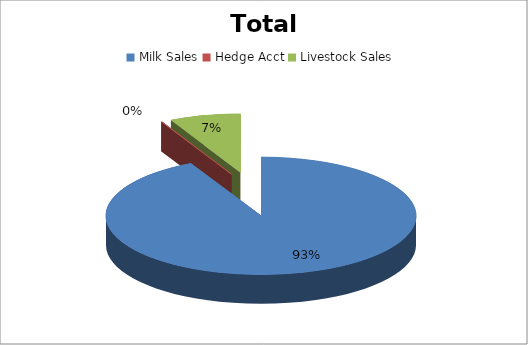
| Category | Series 0 |
|---|---|
| Milk Sales | 2275380 |
| Hedge Acct | 2000 |
| Livestock Sales | 181958 |